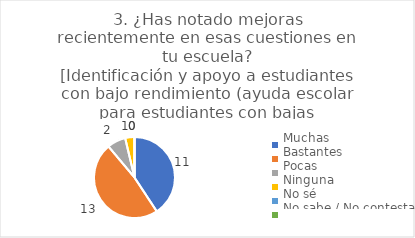
| Category | 3. ¿Has notado mejoras recientemente en esas cuestiones en tu escuela?
[Identificación y apoyo a estudiantes con bajo rendimiento (ayuda escolar para estudiantes con bajas calificaciones)] |
|---|---|
| Muchas  | 0.407 |
| Bastantes  | 0.481 |
| Pocas  | 0.074 |
| Ninguna  | 0.037 |
| No sé  | 0 |
| No sabe / No contesta | 0 |